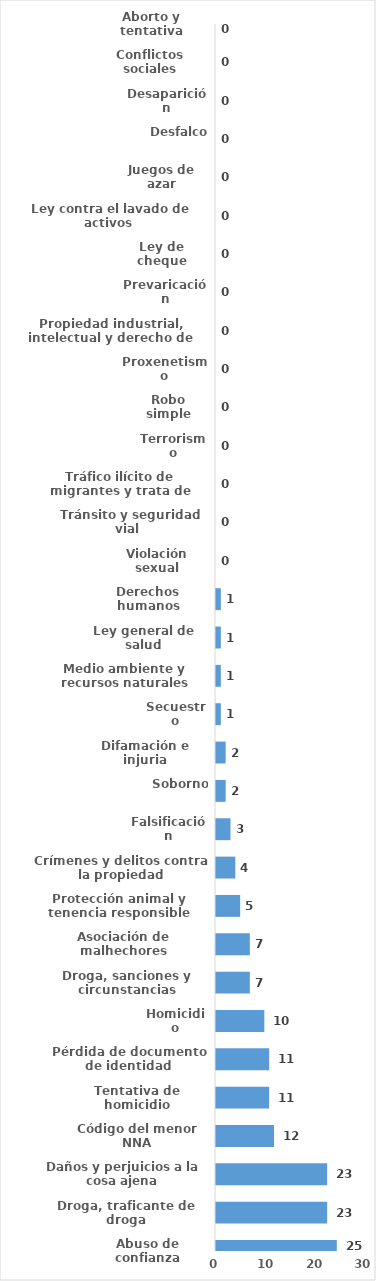
| Category | Series 0 |
|---|---|
| Aborto y tentativa | 0 |
| Conflictos sociales | 0 |
| Desaparición | 0 |
| Desfalco | 0 |
| Juegos de azar | 0 |
| Ley contra el lavado de activos  | 0 |
| Ley de cheque | 0 |
| Prevaricación | 0 |
| Propiedad industrial, intelectual y derecho de autor | 0 |
| Proxenetismo | 0 |
| Robo simple | 0 |
| Terrorismo | 0 |
| Tráfico ilícito de migrantes y trata de personas | 0 |
| Tránsito y seguridad vial  | 0 |
| Violación sexual | 0 |
| Derechos humanos | 1 |
| Ley general de salud | 1 |
| Medio ambiente y recursos naturales | 1 |
| Secuestro | 1 |
| Difamación e injuria | 2 |
| Soborno | 2 |
| Falsificación | 3 |
| Crímenes y delitos contra la propiedad | 4 |
| Protección animal y tenencia responsible | 5 |
| Asociación de malhechores | 7 |
| Droga, sanciones y circunstancias agravantes | 7 |
| Homicidio | 10 |
| Pérdida de documento de identidad | 11 |
| Tentativa de homicidio | 11 |
| Código del menor NNA | 12 |
| Daños y perjuicios a la cosa ajena | 23 |
| Droga, traficante de droga | 23 |
| Abuso de confianza | 25 |